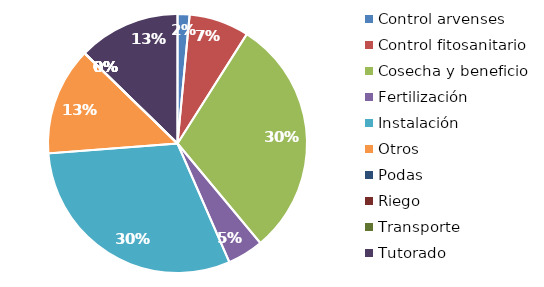
| Category | Valor |
|---|---|
| Control arvenses | 74000 |
| Control fitosanitario | 370000 |
| Cosecha y beneficio | 1480000 |
| Fertilización | 222000 |
| Instalación | 1499000 |
| Otros | 666000 |
| Podas | 0 |
| Riego | 0 |
| Transporte | 0 |
| Tutorado | 629000 |